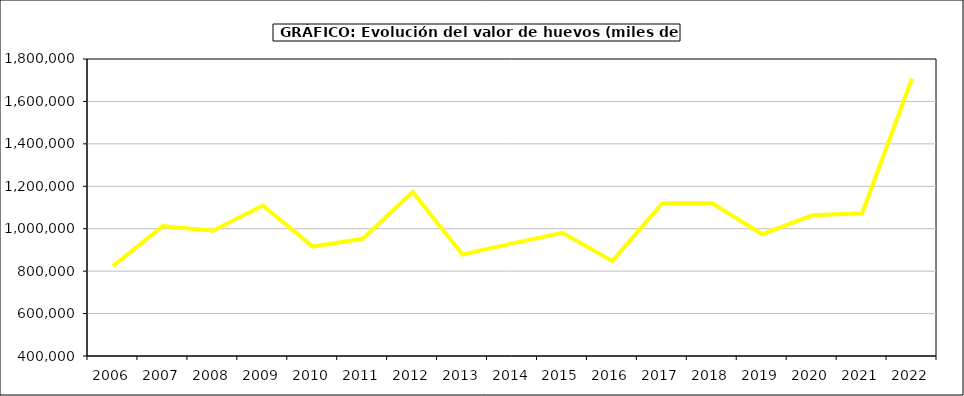
| Category | huevos |
|---|---|
| 2006.0 | 823874.691 |
| 2007.0 | 1012879.578 |
| 2008.0 | 990180.415 |
| 2009.0 | 1109356.704 |
| 2010.0 | 915832.84 |
| 2011.0 | 952462.311 |
| 2012.0 | 1173176.818 |
| 2013.0 | 878243.026 |
| 2014.0 | 930912.202 |
| 2015.0 | 980944.68 |
| 2016.0 | 848224 |
| 2017.0 | 1119773.503 |
| 2018.0 | 1119711.329 |
| 2019.0 | 974085.433 |
| 2020.0 | 1062988.438 |
| 2021.0 | 1072846 |
| 2022.0 | 1708291.715 |